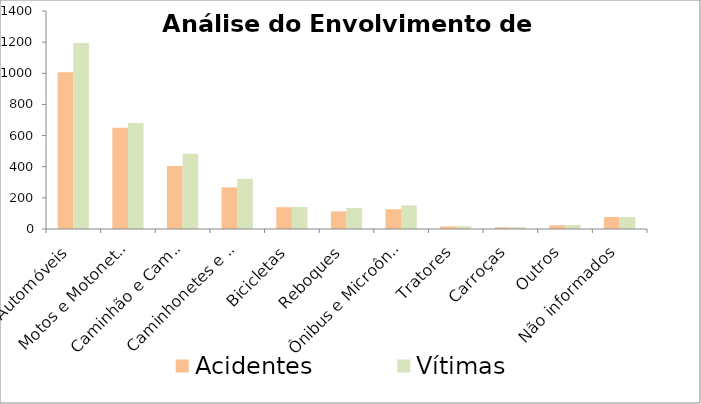
| Category | Acidentes | Vítimas |
|---|---|---|
| Automóveis | 1007 | 1195 |
| Motos e Motonetas | 651 | 681 |
| Caminhão e Caminhão Trator | 404 | 484 |
| Caminhonetes e Camionetas | 267 | 322 |
| Bicicletas | 140 | 141 |
| Reboques | 113 | 135 |
| Ônibus e Microônibus | 127 | 152 |
| Tratores | 17 | 18 |
| Carroças | 11 | 11 |
| Outros | 24 | 26 |
| Não informados | 77 | 77 |